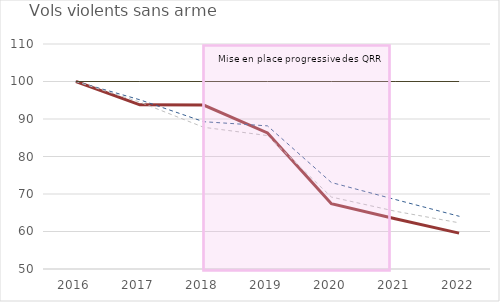
| Category | QRR | Unités urbaines englobantes | Unités urbaines de plus de 10 000 hab. | Series 0 |
|---|---|---|---|---|
| 2016.0 | 100 | 100 | 100 | 100 |
| 2017.0 | 93.769 | 95.132 | 94.52 | 100 |
| 2018.0 | 93.728 | 89.278 | 87.789 | 100 |
| 2019.0 | 86.286 | 88.17 | 85.576 | 100 |
| 2020.0 | 67.4 | 73.066 | 69.194 | 100 |
| 2021.0 | 63.384 | 68.539 | 65.407 | 100 |
| 2022.0 | 59.574 | 64.071 | 62.318 | 100 |